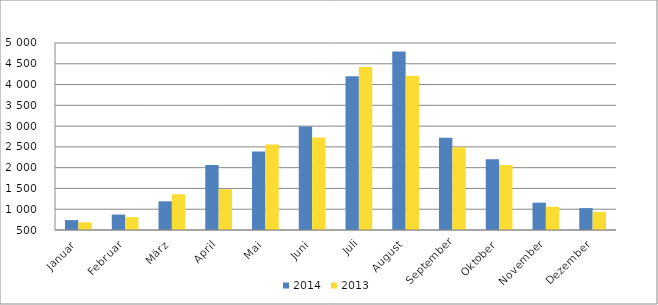
| Category | 2014 | 2013 |
|---|---|---|
| Januar | 737949 | 686519 |
| Februar | 871166 | 810663 |
| März | 1189766 | 1359752 |
| April | 2064644 | 1480218 |
| Mai | 2391127 | 2556394 |
| Juni | 2991121 | 2727144 |
| Juli | 4198952 | 4421298 |
| August | 4795961 | 4211282 |
| September | 2717745 | 2494002 |
| Oktober | 2205424 | 2063935 |
| November | 1157366 | 1058604 |
| Dezember | 1026149 | 936409 |